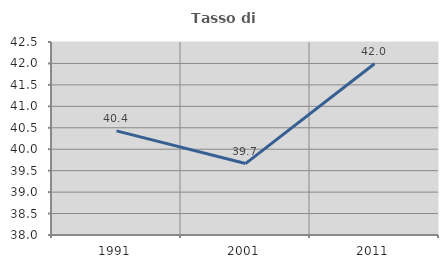
| Category | Tasso di occupazione   |
|---|---|
| 1991.0 | 40.428 |
| 2001.0 | 39.666 |
| 2011.0 | 41.994 |